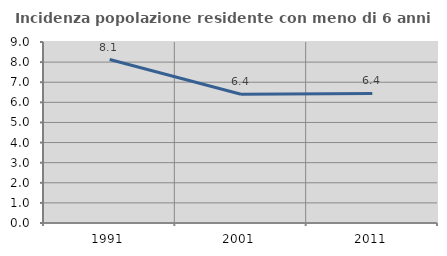
| Category | Incidenza popolazione residente con meno di 6 anni |
|---|---|
| 1991.0 | 8.13 |
| 2001.0 | 6.404 |
| 2011.0 | 6.439 |